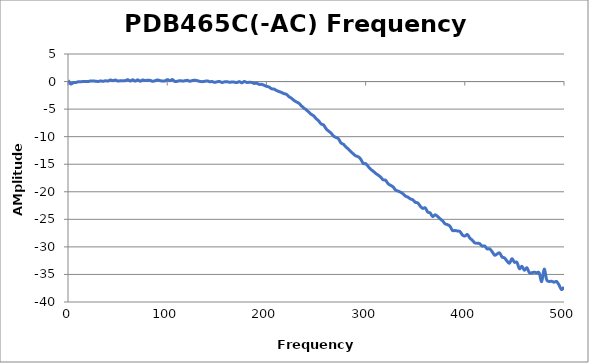
| Category | Series 0 |
|---|---|
| 0.3 | 0.208 |
| 2.7985 | -0.44 |
| 5.297 | -0.214 |
| 7.7955 | -0.17 |
| 10.294 | -0.049 |
| 12.7925 | -0.046 |
| 15.291 | 0.017 |
| 17.7895 | 0.02 |
| 20.288 | 0 |
| 22.7865 | 0.109 |
| 25.285 | 0.103 |
| 27.7835 | 0.067 |
| 30.282 | 0.014 |
| 32.7805 | 0.118 |
| 35.279 | 0.047 |
| 37.7775 | 0.144 |
| 40.276 | 0.094 |
| 42.7745 | 0.285 |
| 45.273 | 0.159 |
| 47.7715 | 0.275 |
| 50.27 | 0.098 |
| 52.7685 | 0.146 |
| 55.267 | 0.138 |
| 57.7655 | 0.168 |
| 60.264 | 0.34 |
| 62.7625 | 0.095 |
| 65.261 | 0.322 |
| 67.7595 | 0.08 |
| 70.258 | 0.312 |
| 72.7565 | 0.062 |
| 75.255 | 0.281 |
| 77.7535 | 0.173 |
| 80.252 | 0.238 |
| 82.7505 | 0.217 |
| 85.249 | 0.054 |
| 87.7475 | 0.15 |
| 90.246 | 0.296 |
| 92.7445 | 0.171 |
| 95.243 | 0.1 |
| 97.7415 | 0.117 |
| 100.24 | 0.345 |
| 102.7385 | 0.165 |
| 105.237 | 0.365 |
| 107.7355 | 0.016 |
| 110.234 | 0.055 |
| 112.7325 | 0.164 |
| 115.231 | 0.098 |
| 117.7295 | 0.143 |
| 120.228 | 0.218 |
| 122.7265 | 0.062 |
| 125.225 | 0.17 |
| 127.7235 | 0.243 |
| 130.222 | 0.161 |
| 132.7205 | 0.03 |
| 135.219 | -0.019 |
| 137.7175 | 0.039 |
| 140.216 | 0.12 |
| 142.7145 | -0.023 |
| 145.213 | -0.001 |
| 147.7115 | -0.135 |
| 150.21 | -0.057 |
| 152.7085 | 0.021 |
| 155.207 | -0.176 |
| 157.7055 | -0.052 |
| 160.204 | -0.021 |
| 162.7025 | -0.12 |
| 165.201 | -0.089 |
| 167.6995 | -0.107 |
| 170.198 | -0.189 |
| 172.6965 | -0.01 |
| 175.195 | -0.232 |
| 177.6935 | 0.016 |
| 180.192 | -0.158 |
| 182.6905 | -0.141 |
| 185.189 | -0.161 |
| 187.6875 | -0.338 |
| 190.186 | -0.298 |
| 192.6845 | -0.512 |
| 195.183 | -0.51 |
| 197.6815 | -0.675 |
| 200.18 | -0.867 |
| 202.6785 | -0.991 |
| 205.177 | -1.302 |
| 207.6755 | -1.372 |
| 210.174 | -1.624 |
| 212.6725 | -1.808 |
| 215.171 | -1.968 |
| 217.6695 | -2.188 |
| 220.168 | -2.317 |
| 222.6665 | -2.743 |
| 225.165 | -3.008 |
| 227.6635 | -3.404 |
| 230.162 | -3.678 |
| 232.6605 | -3.927 |
| 235.159 | -4.381 |
| 237.6575 | -4.795 |
| 240.156 | -5.117 |
| 242.6545 | -5.531 |
| 245.153 | -5.938 |
| 247.6515 | -6.229 |
| 250.15 | -6.729 |
| 252.6485 | -7.128 |
| 255.147 | -7.691 |
| 257.6455 | -7.883 |
| 260.144 | -8.553 |
| 262.6425 | -8.985 |
| 265.141 | -9.348 |
| 267.6395 | -9.888 |
| 270.138 | -10.148 |
| 272.6365 | -10.38 |
| 275.135 | -11.132 |
| 277.6335 | -11.379 |
| 280.132 | -11.869 |
| 282.6305 | -12.247 |
| 285.129 | -12.694 |
| 287.6275 | -13.129 |
| 290.126 | -13.494 |
| 292.6245 | -13.644 |
| 295.123 | -14.094 |
| 297.6215 | -14.862 |
| 300.12 | -14.904 |
| 302.6185 | -15.41 |
| 305.117 | -15.922 |
| 307.6155 | -16.252 |
| 310.114 | -16.658 |
| 312.6125 | -16.966 |
| 315.111 | -17.326 |
| 317.6095 | -17.813 |
| 320.108 | -17.903 |
| 322.6065 | -18.524 |
| 325.105 | -18.825 |
| 327.6035 | -19.096 |
| 330.102 | -19.664 |
| 332.6005 | -19.868 |
| 335.099 | -20.058 |
| 337.5975 | -20.356 |
| 340.096 | -20.781 |
| 342.5945 | -20.971 |
| 345.093 | -21.29 |
| 347.5915 | -21.462 |
| 350.09 | -21.911 |
| 352.5885 | -22.029 |
| 355.087 | -22.602 |
| 357.5855 | -23.016 |
| 360.084 | -22.92 |
| 362.5825 | -23.672 |
| 365.081 | -23.844 |
| 367.5795 | -24.481 |
| 370.078 | -24.173 |
| 372.5765 | -24.474 |
| 375.075 | -24.897 |
| 377.5735 | -25.278 |
| 380.072 | -25.801 |
| 382.5705 | -25.968 |
| 385.069 | -26.26 |
| 387.5675 | -27.018 |
| 390.066 | -27.026 |
| 392.5645 | -27.116 |
| 395.063 | -27.205 |
| 397.5615 | -27.833 |
| 400.06 | -28.042 |
| 402.5585 | -27.749 |
| 405.057 | -28.398 |
| 407.5555 | -28.784 |
| 410.054 | -29.272 |
| 412.5525 | -29.322 |
| 415.051 | -29.417 |
| 417.5495 | -29.857 |
| 420.048 | -29.836 |
| 422.5465 | -30.36 |
| 425.045 | -30.355 |
| 427.5435 | -30.861 |
| 430.042 | -31.503 |
| 432.5405 | -31.297 |
| 435.039 | -31.092 |
| 437.5375 | -31.829 |
| 440.036 | -32.006 |
| 442.5345 | -32.565 |
| 445.033 | -32.965 |
| 447.5315 | -32.14 |
| 450.03 | -32.79 |
| 452.5285 | -32.797 |
| 455.027 | -33.955 |
| 457.5255 | -33.517 |
| 460.024 | -34.238 |
| 462.5225 | -33.787 |
| 465.021 | -34.645 |
| 467.5195 | -34.697 |
| 470.018 | -34.594 |
| 472.5165 | -34.698 |
| 475.015 | -34.717 |
| 477.5135 | -36.294 |
| 480.012 | -34.025 |
| 482.5105 | -35.968 |
| 485.009 | -36.266 |
| 487.5075 | -36.236 |
| 490.006 | -36.411 |
| 492.5045 | -36.276 |
| 495.003 | -36.925 |
| 497.5015 | -37.749 |
| 500.0 | -37.291 |